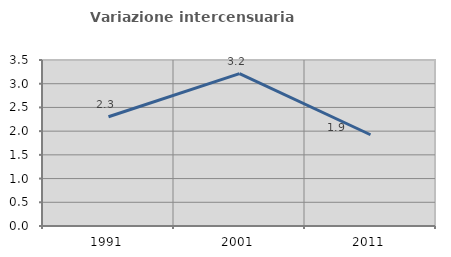
| Category | Variazione intercensuaria annua |
|---|---|
| 1991.0 | 2.304 |
| 2001.0 | 3.213 |
| 2011.0 | 1.924 |